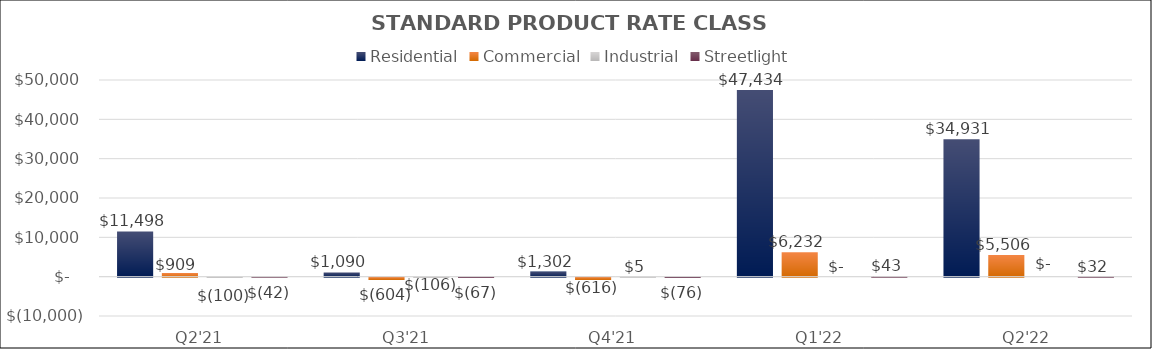
| Category | Residential | Commercial | Industrial | Streetlight |
|---|---|---|---|---|
| Q2'21 | 11498.159 | 908.945 | -99.781 | -41.653 |
| Q3'21 | 1089.763 | -604.482 | -105.976 | -66.77 |
| Q4'21 | 1302.024 | -615.876 | 5.28 | -76.121 |
| Q1'22 | 47433.831 | 6232.078 | 0 | 43.006 |
| Q2'22 | 34930.937 | 5506.476 | 0 | 31.67 |